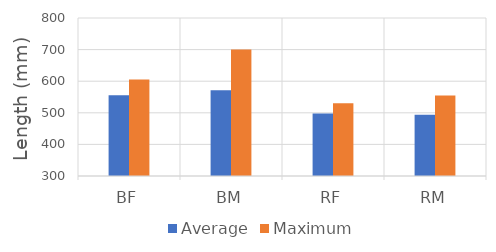
| Category | Average | Maximum |
|---|---|---|
| BF | 555.833 | 605 |
| BM | 571.111 | 700 |
| RF | 497.5 | 530 |
| RM | 493.75 | 555 |